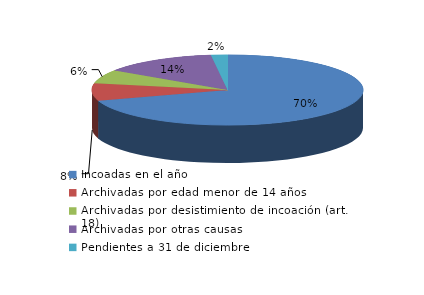
| Category | Series 0 |
|---|---|
| Incoadas en el año | 431 |
| Archivadas por edad menor de 14 años | 49 |
| Archivadas por desistimiento de incoación (art. 18) | 39 |
| Archivadas por otras causas | 84 |
| Pendientes a 31 de diciembre | 12 |